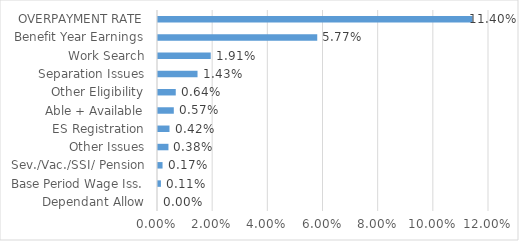
| Category | Series 0 |
|---|---|
| Dependant Allow | 0 |
| Base Period Wage Iss. | 0.001 |
| Sev./Vac./SSI/ Pension | 0.002 |
| Other Issues | 0.004 |
| ES Registration | 0.004 |
| Able + Available | 0.006 |
| Other Eligibility | 0.006 |
| Separation Issues | 0.014 |
| Work Search | 0.019 |
| Benefit Year Earnings | 0.058 |
| OVERPAYMENT RATE | 0.114 |